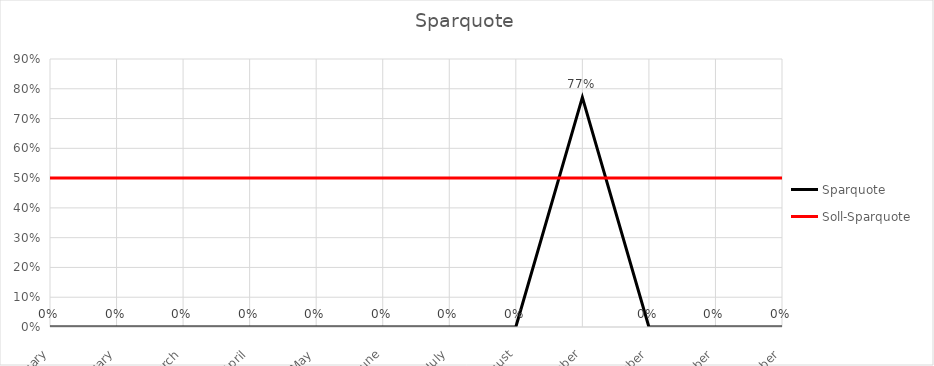
| Category | Sparquote | Soll-Sparquote |
|---|---|---|
| 2018-01-01 | 0 | 0.5 |
| 2018-02-01 | 0 | 0.5 |
| 2018-03-01 | 0 | 0.5 |
| 2018-04-01 | 0 | 0.5 |
| 2018-05-01 | 0 | 0.5 |
| 2018-06-01 | 0 | 0.5 |
| 2018-07-01 | 0 | 0.5 |
| 2018-08-01 | 0 | 0.5 |
| 2018-09-01 | 0.771 | 0.5 |
| 2018-10-01 | 0 | 0.5 |
| 2018-11-01 | 0 | 0.5 |
| 2018-12-01 | 0 | 0.5 |